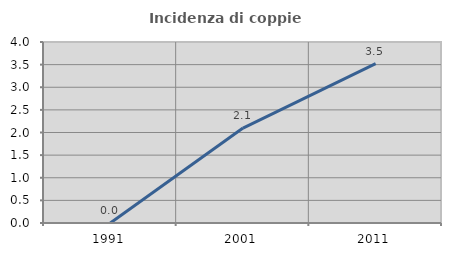
| Category | Incidenza di coppie miste |
|---|---|
| 1991.0 | 0 |
| 2001.0 | 2.098 |
| 2011.0 | 3.524 |